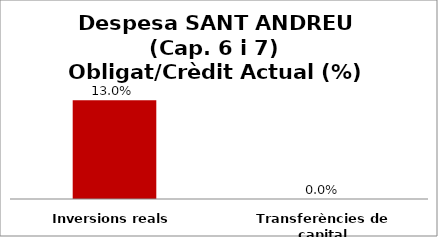
| Category | Series 0 |
|---|---|
| Inversions reals | 0.13 |
| Transferències de capital | 0 |